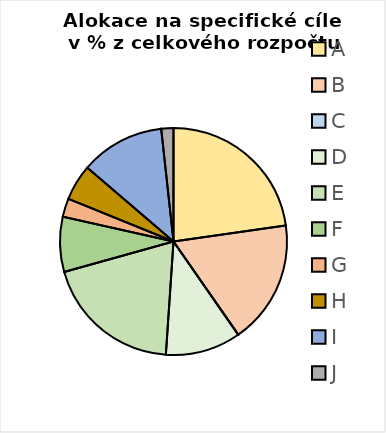
| Category | Series 0 |
|---|---|
| A | 0.227 |
| B | 0.176 |
| C | 0 |
| D | 0.107 |
| E | 0.196 |
| F | 0.079 |
| G | 0.026 |
| H | 0.051 |
| I | 0.12 |
| J | 0.017 |